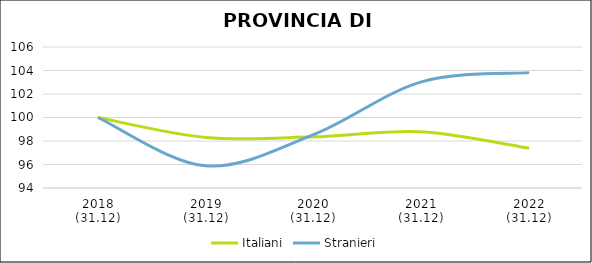
| Category | Italiani | Stranieri |
|---|---|---|
| 2018
(31.12) | 100 | 100 |
| 2019
(31.12) | 98.305 | 95.889 |
| 2020
(31.12) | 98.355 | 98.538 |
| 2021
(31.12) | 98.793 | 103.033 |
| 2022
(31.12) | 97.376 | 103.819 |